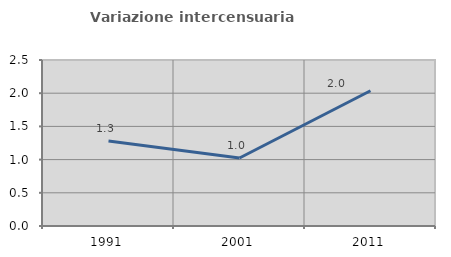
| Category | Variazione intercensuaria annua |
|---|---|
| 1991.0 | 1.281 |
| 2001.0 | 1.025 |
| 2011.0 | 2.037 |